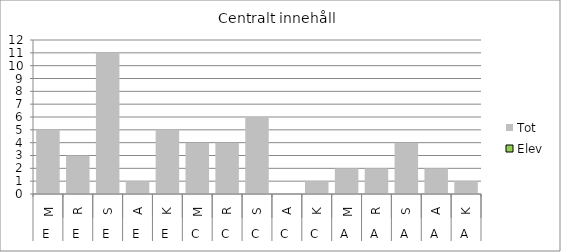
| Category | Tot | Elev |
|---|---|---|
| 0 | 5 | 0 |
| 1 | 3 | 0 |
| 2 | 11 | 0 |
| 3 | 1 | 0 |
| 4 | 5 | 0 |
| 5 | 4 | 0 |
| 6 | 4 | 0 |
| 7 | 6 | 0 |
| 8 | 0 | 0 |
| 9 | 1 | 0 |
| 10 | 2 | 0 |
| 11 | 2 | 0 |
| 12 | 4 | 0 |
| 13 | 2 | 0 |
| 14 | 1 | 0 |